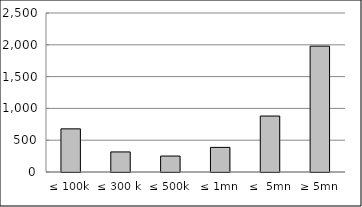
| Category | Series 0 |
|---|---|
| ≤ 100k | 678464231.108 |
| ≤ 300 k | 315505417.061 |
| ≤ 500k | 250718924.75 |
| ≤ 1mn | 387032336.79 |
| ≤  5mn | 879937539.695 |
| ≥ 5mn | 1978758402.572 |